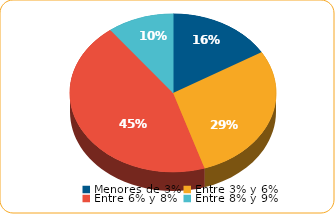
| Category | Series 0 |
|---|---|
| Menores de 3% | 2080.9 |
| Entre 3% y 6% | 3632.9 |
| Entre 6% y 8% | 5646.5 |
| Entre 8% y 9% | 1317.4 |